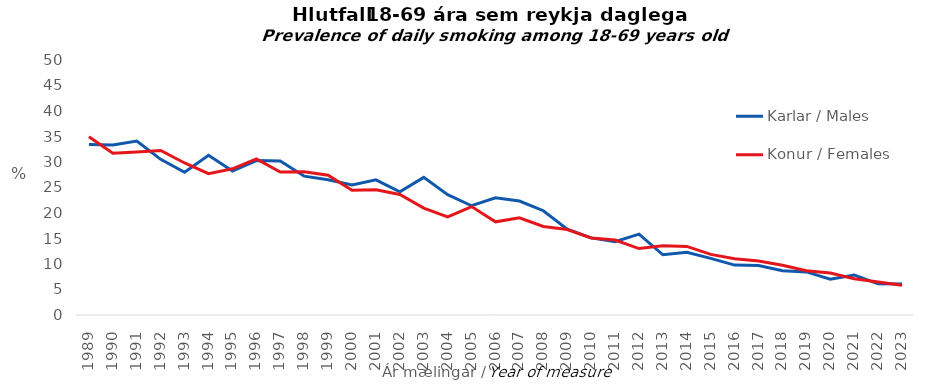
| Category | Karlar / Males | Konur / Females |
|---|---|---|
| 1989.0 | 33.453 | 34.938 |
| 1990.0 | 33.357 | 31.701 |
| 1991.0 | 34.124 | 31.968 |
| 1992.0 | 30.526 | 32.268 |
| 1993.0 | 28 | 29.811 |
| 1994.0 | 31.305 | 27.714 |
| 1995.0 | 28.211 | 28.673 |
| 1996.0 | 30.271 | 30.614 |
| 1997.0 | 30.193 | 28.036 |
| 1998.0 | 27.226 | 28.105 |
| 1999.0 | 26.51 | 27.403 |
| 2000.0 | 25.52 | 24.444 |
| 2001.0 | 26.505 | 24.558 |
| 2002.0 | 24.172 | 23.636 |
| 2003.0 | 26.983 | 20.969 |
| 2004.0 | 23.591 | 19.255 |
| 2005.0 | 21.422 | 21.256 |
| 2006.0 | 22.987 | 18.269 |
| 2007.0 | 22.346 | 19.071 |
| 2008.0 | 20.451 | 17.367 |
| 2009.0 | 16.846 | 16.771 |
| 2010.0 | 15.119 | 15.097 |
| 2011.0 | 14.355 | 14.704 |
| 2012.0 | 15.861 | 13.029 |
| 2013.0 | 11.803 | 13.558 |
| 2014.0 | 12.31 | 13.45 |
| 2015.0 | 11.096 | 11.883 |
| 2016.0 | 9.787 | 11.04 |
| 2017.0 | 9.707 | 10.58 |
| 2018.0 | 8.671 | 9.744 |
| 2019.0 | 8.454 | 8.679 |
| 2020.0 | 7.013 | 8.245 |
| 2021.0 | 7.843 | 7.118 |
| 2022.0 | 6.103 | 6.454 |
| 2023.0 | 6.085 | 5.823 |